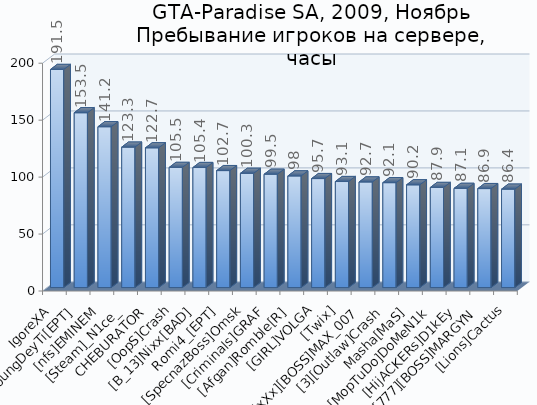
| Category | Series 0 |
|---|---|
| IgoreXA | 191.5 |
| YoungDeyTi[EPT] | 153.5 |
| [nfs]EMINEM | 141.2 |
| [Steam]_N1ce_ | 123.3 |
| CHEBURATOR | 122.7 |
| [OopS]Crash | 105.5 |
| [B_13]Nixx[BAD] | 105.4 |
| Romi4_[EPT] | 102.7 |
| [SpecnazBoss]Omsk | 100.3 |
| [Criminals]GRAF | 99.5 |
| [Afgan]Romble[R] | 98 |
| [GIRL]VOLGA | 95.7 |
| [Twix] | 93.1 |
| [xXx][BOSS]MAX_007 | 92.7 |
| [3][Outlaw]Crash | 92.1 |
| Masha[MaS] | 90.2 |
| [MopTuDo]DoMeN1k | 87.9 |
| [HijACKERs]D1kEy | 87.1 |
| [777][BOSS]MARGYN | 86.9 |
| [Lions]Cactus | 86.4 |